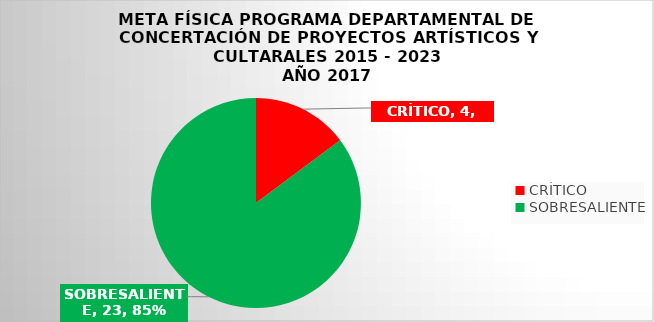
| Category | Series 0 |
|---|---|
| CRÍTICO | 4 |
| SOBRESALIENTE | 23 |